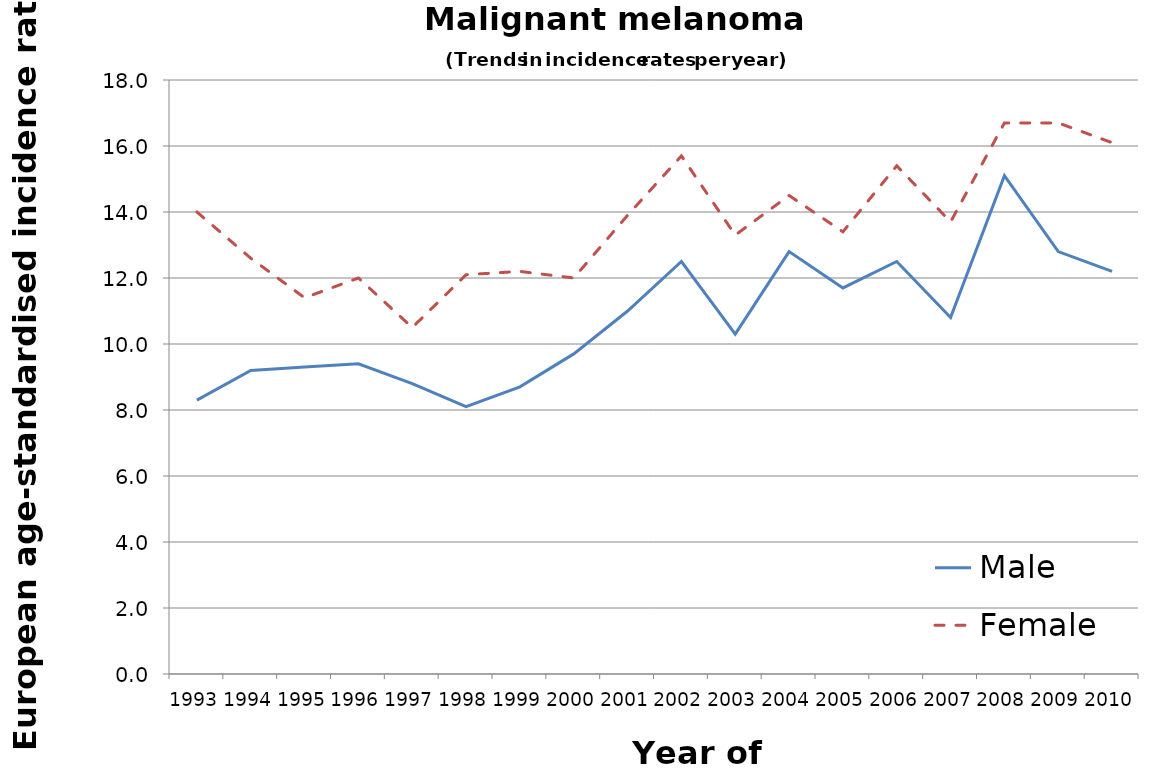
| Category | Male | Female |
|---|---|---|
| 1993.0 | 8.3 | 14 |
| 1994.0 | 9.2 | 12.6 |
| 1995.0 | 9.3 | 11.4 |
| 1996.0 | 9.4 | 12 |
| 1997.0 | 8.8 | 10.5 |
| 1998.0 | 8.1 | 12.1 |
| 1999.0 | 8.7 | 12.2 |
| 2000.0 | 9.7 | 12 |
| 2001.0 | 11 | 13.9 |
| 2002.0 | 12.5 | 15.7 |
| 2003.0 | 10.3 | 13.3 |
| 2004.0 | 12.8 | 14.5 |
| 2005.0 | 11.7 | 13.4 |
| 2006.0 | 12.5 | 15.4 |
| 2007.0 | 10.8 | 13.7 |
| 2008.0 | 15.1 | 16.7 |
| 2009.0 | 12.8 | 16.7 |
| 2010.0 | 12.2 | 16.1 |